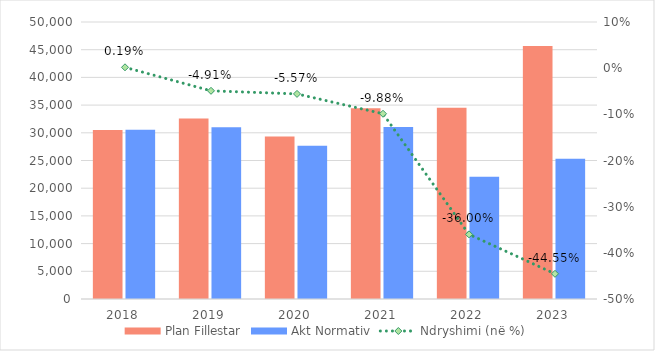
| Category | Plan Fillestar | Akt Normativ |
|---|---|---|
| 2018.0 | 30510 | 30567 |
| 2019.0 | 32600 | 31000 |
| 2020.0 | 29318 | 27684 |
| 2021.0 | 34428 | 31028 |
| 2022.0 | 34502 | 22082 |
| 2023.0 | 45660 | 25320 |